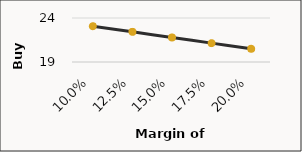
| Category | Margin of Safety vs. Buy Prices |
|---|---|
| 0.1 | 23.066 |
| 0.125 | 22.425 |
| 0.15 | 21.784 |
| 0.175 | 21.144 |
| 0.19999999999999998 | 20.503 |